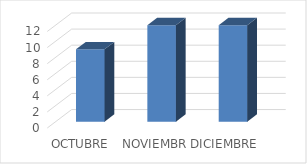
| Category | Series 0 |
|---|---|
| OCTUBRE | 9 |
| NOVIEMBRE | 12 |
| DICIEMBRE | 12 |